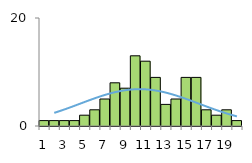
| Category | increment | normal approx. |
|---|---|---|
| 0 | 1 | 2.128 |
| 1 | 1 | 2.727 |
| 2 | 1 | 3.392 |
| 3 | 1 | 4.096 |
| 4 | 2 | 4.804 |
| 5 | 3 | 5.47 |
| 6 | 5 | 6.047 |
| 7 | 8 | 6.492 |
| 8 | 7 | 6.766 |
| 9 | 13 | 6.848 |
| 10 | 12 | 6.729 |
| 11 | 9 | 6.42 |
| 12 | 4 | 5.948 |
| 13 | 5 | 5.35 |
| 14 | 9 | 4.672 |
| 15 | 9 | 3.962 |
| 16 | 3 | 3.262 |
| 17 | 2 | 2.608 |
| 18 | 3 | 2.025 |
| 19 | 1 | 1.526 |